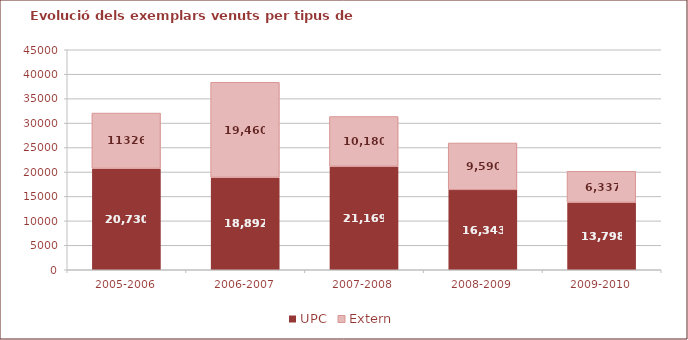
| Category | UPC | Extern |
|---|---|---|
| 2005-2006 | 20730 | 11326 |
| 2006-2007 | 18892 | 19460 |
| 2007-2008 | 21169 | 10180 |
| 2008-2009 | 16343 | 9590 |
| 2009-2010 | 13798 | 6337 |